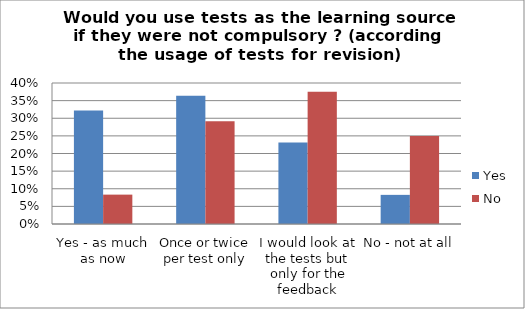
| Category | Yes | No |
|---|---|---|
| Yes - as much as now | 0.322 | 0.083 |
| Once or twice per test only | 0.364 | 0.292 |
| I would look at the tests but only for the feedback | 0.231 | 0.375 |
| No - not at all | 0.083 | 0.25 |